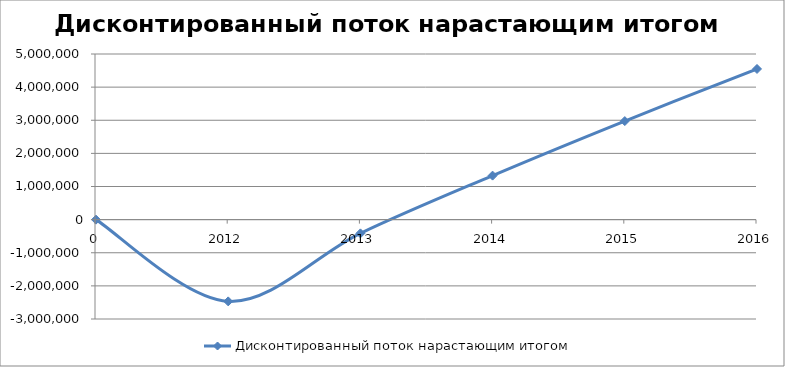
| Category | Дисконтированный поток нарастающим итогом |
|---|---|
| 0.0 | 0 |
| 2012.0 | -2468377.803 |
| 2013.0 | -414865.827 |
| 2014.0 | 1328619.264 |
| 2015.0 | 2974846.478 |
| 2016.0 | 4548245.07 |